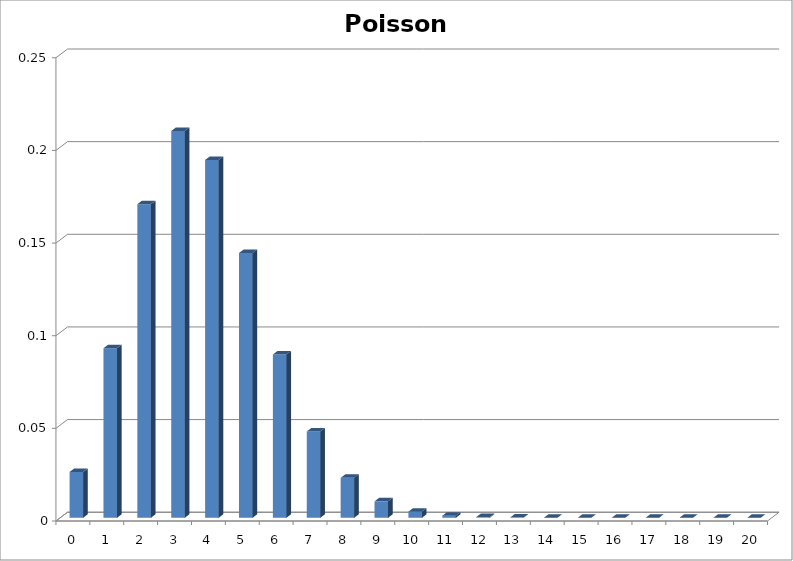
| Category | Series 0 |
|---|---|
| 0.0 | 0.025 |
| 1.0 | 0.091 |
| 2.0 | 0.169 |
| 3.0 | 0.209 |
| 4.0 | 0.193 |
| 5.0 | 0.143 |
| 6.0 | 0.088 |
| 7.0 | 0.047 |
| 8.0 | 0.022 |
| 9.0 | 0.009 |
| 10.0 | 0.003 |
| 11.0 | 0.001 |
| 12.0 | 0 |
| 13.0 | 0 |
| 14.0 | 0 |
| 15.0 | 0 |
| 16.0 | 0 |
| 17.0 | 0 |
| 18.0 | 0 |
| 19.0 | 0 |
| 20.0 | 0 |